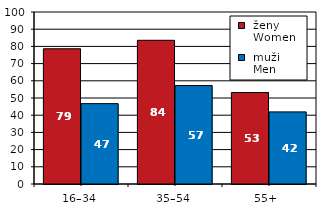
| Category |  ženy 
 Women |  muži 
 Men |
|---|---|---|
| 16–34 | 78.624 | 46.722 |
| 35–54 | 83.554 | 57.228 |
| 55+  | 53.185 | 41.926 |